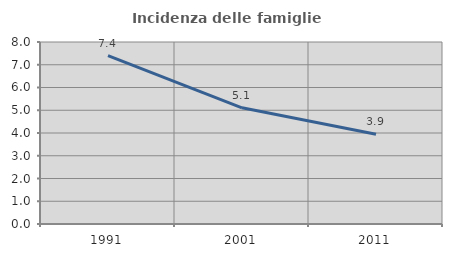
| Category | Incidenza delle famiglie numerose |
|---|---|
| 1991.0 | 7.4 |
| 2001.0 | 5.109 |
| 2011.0 | 3.946 |